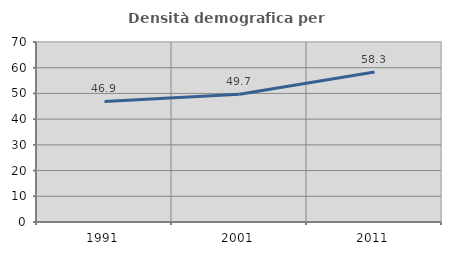
| Category | Densità demografica |
|---|---|
| 1991.0 | 46.894 |
| 2001.0 | 49.678 |
| 2011.0 | 58.341 |